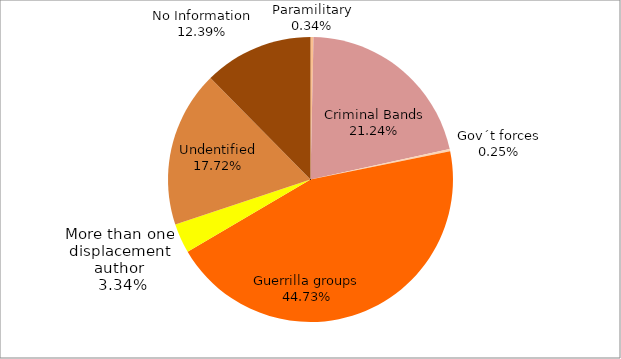
| Category | Series 0 |
|---|---|
| Paramilitary | 0.003 |
| Criminal Bands  | 0.212 |
| Gov´t forces  | 0.002 |
| Guerrilla groups  | 0.447 |
| More than one displacement author  | 0.033 |
| Undentified | 0.177 |
| No Information  | 0.124 |